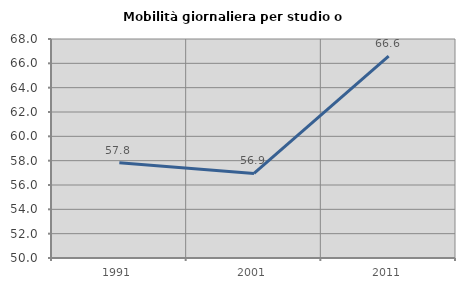
| Category | Mobilità giornaliera per studio o lavoro |
|---|---|
| 1991.0 | 57.832 |
| 2001.0 | 56.948 |
| 2011.0 | 66.587 |